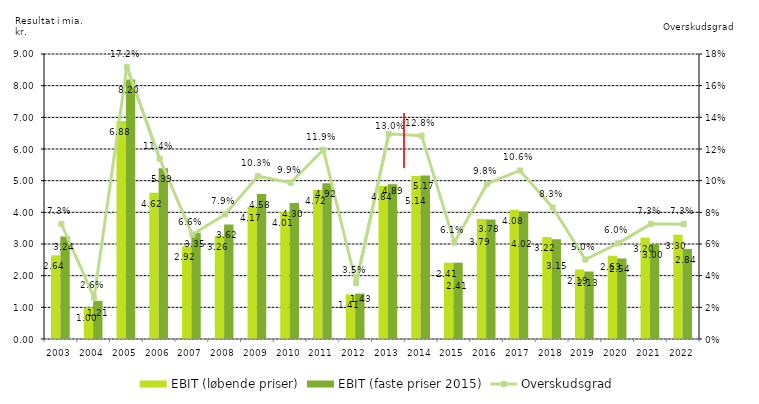
| Category | EBIT (løbende priser) | EBIT (faste priser 2015) |
|---|---|---|
| 2003.0 | 2.643 | 3.239 |
| 2004.0 | 0.995 | 1.206 |
| 2005.0 | 6.885 | 8.196 |
| 2006.0 | 4.616 | 5.393 |
| 2007.0 | 2.922 | 3.355 |
| 2008.0 | 3.26 | 3.618 |
| 2009.0 | 4.174 | 4.576 |
| 2010.0 | 4.007 | 4.295 |
| 2011.0 | 4.716 | 4.917 |
| 2012.0 | 1.408 | 1.434 |
| 2013.0 | 4.838 | 4.886 |
| 2014.0 | 5.145 | 5.165 |
| 2015.0 | 2.41 | 2.41 |
| 2016.0 | 3.787 | 3.776 |
| 2017.0 | 4.078 | 4.023 |
| 2018.0 | 3.22 | 3.151 |
| 2019.0 | 2.194 | 2.131 |
| 2020.0 | 2.63 | 2.543 |
| 2021.0 | 3.196 | 2.998 |
| 2022.0 | 3.296 | 2.844 |